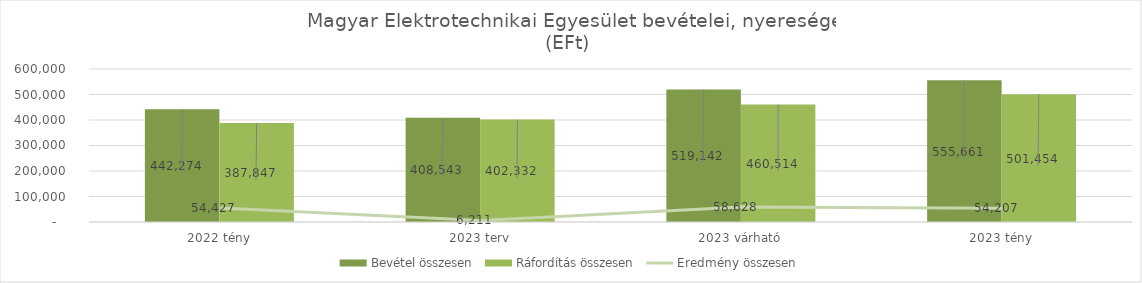
| Category | Bevétel összesen | Ráfordítás összesen |
|---|---|---|
| 2022 tény | 442273.725 | 387847.009 |
| 2023 terv | 408543 | 402332 |
| 2023 várható | 519141.764 | 460514.034 |
| 2023 tény | 555661.053 | 501454.129 |